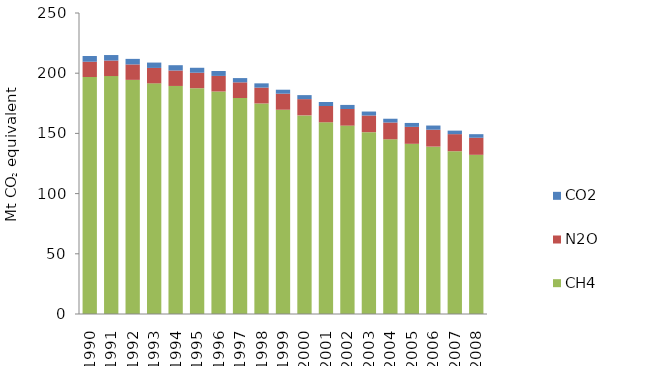
| Category | CH4 | N2O | CO2 |
|---|---|---|---|
| 1990 | 196.824 | 12.705 | 4.734 |
| 1991 | 197.63 | 12.874 | 4.582 |
| 1992 | 194.451 | 12.838 | 4.605 |
| 1993 | 191.568 | 12.811 | 4.451 |
| 1994 | 189.404 | 12.837 | 4.403 |
| 1995 | 187.543 | 12.851 | 4.113 |
| 1996 | 184.809 | 12.94 | 4.063 |
| 1997 | 179.415 | 12.989 | 3.54 |
| 1998 | 174.859 | 13.159 | 3.556 |
| 1999 | 169.651 | 13.334 | 3.297 |
| 2000 | 164.963 | 13.505 | 3.33 |
| 2001 | 159.226 | 13.512 | 3.34 |
| 2002 | 156.463 | 13.799 | 3.393 |
| 2003 | 151.012 | 13.845 | 3.306 |
| 2004 | 145.121 | 13.918 | 3.145 |
| 2005 | 141.355 | 14.059 | 3.271 |
| 2006 | 139.015 | 14.057 | 3.462 |
| 2007 | 135.206 | 14.174 | 2.922 |
| 2008 | 132.216 | 14.172 | 2.972 |